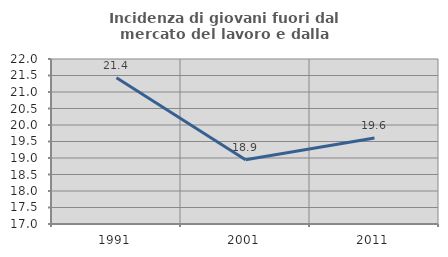
| Category | Incidenza di giovani fuori dal mercato del lavoro e dalla formazione  |
|---|---|
| 1991.0 | 21.429 |
| 2001.0 | 18.947 |
| 2011.0 | 19.608 |